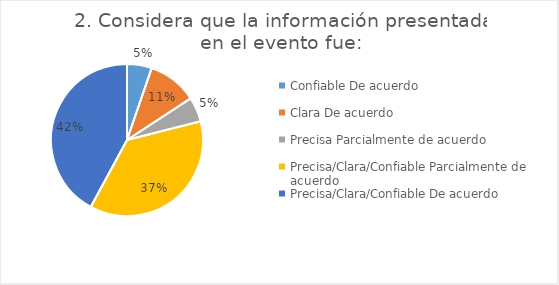
| Category | Series 0 |
|---|---|
| 0 | 1 |
| 1 | 2 |
| 2 | 1 |
| 3 | 7 |
| 4 | 8 |